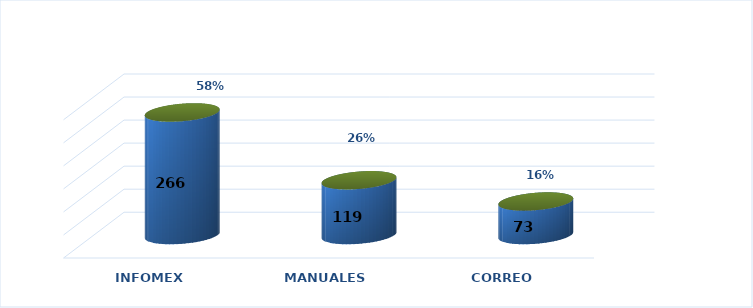
| Category | Series 0 | Series 1 |
|---|---|---|
| INFOMEX | 266 | 0.581 |
| MANUALES | 119 | 0.26 |
| CORREO | 73 | 0.159 |